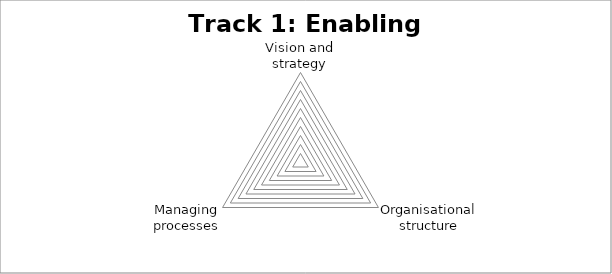
| Category | Series 0 |
|---|---|
| Vision and strategy | 0 |
| Organisational structure | 0 |
| Managing processes | 0 |